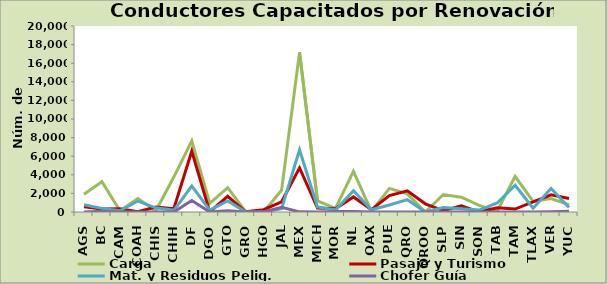
| Category | Carga | Pasaje y Turismo | Mat. y Residuos Pelig. | Chofer Guía |
|---|---|---|---|---|
| AGS | 1899 | 566 | 779 | 0 |
| BC | 3262 | 315 | 390 | 77 |
| CAM | 133 | 345 | 139 | 7 |
| COAH | 1434 | 27 | 1180 | 0 |
| CHIS | 124 | 532 | 452 | 0 |
| CHIH | 3756 | 355 | 182 | 0 |
| DF | 7653 | 6538 | 2795 | 1226 |
| DGO | 937 | 0 | 211 | 0 |
| GTO | 2619 | 1682 | 1198 | 131 |
| GRO | 47 | 15 | 11 | 6 |
| HGO | 0 | 247 | 3 | 0 |
| JAL | 2354 | 1102 | 367 | 500 |
| MEX | 17181 | 4749 | 6674 | 16 |
| MICH | 1192 | 427 | 535 | 0 |
| MOR | 394 | 354 | 204 | 42 |
| NL | 4376 | 1620 | 2285 | 67 |
| OAX | 73 | 244 | 234 | 0 |
| PUE | 2537 | 1772 | 751 | 0 |
| QRO | 1947 | 2278 | 1324 | 0 |
| QROO | 0 | 882 | 0 | 0 |
| SLP | 1877 | 149 | 485 | 0 |
| SIN | 1593 | 652 | 359 | 7 |
| SON | 711 | 0 | 207 | 0 |
| TAB | 80 | 451 | 967 | 0 |
| TAM | 3831 | 319 | 2881 | 0 |
| TLAX | 1134 | 1082 | 406 | 0 |
| VER | 1443 | 1856 | 2527 | 26 |
| YUC | 760 | 1452 | 481 | 80 |